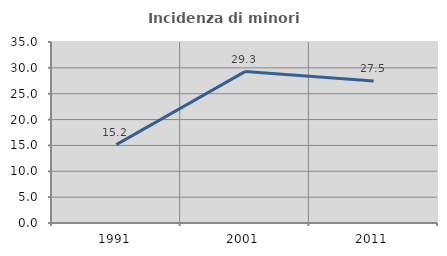
| Category | Incidenza di minori stranieri |
|---|---|
| 1991.0 | 15.152 |
| 2001.0 | 29.279 |
| 2011.0 | 27.46 |